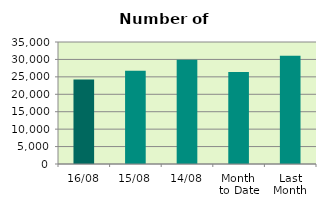
| Category | Series 0 |
|---|---|
| 16/08 | 24210 |
| 15/08 | 26780 |
| 14/08 | 29918 |
| Month 
to Date | 26384 |
| Last
Month | 31061.545 |